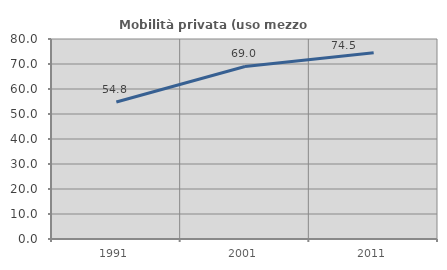
| Category | Mobilità privata (uso mezzo privato) |
|---|---|
| 1991.0 | 54.816 |
| 2001.0 | 69.007 |
| 2011.0 | 74.481 |